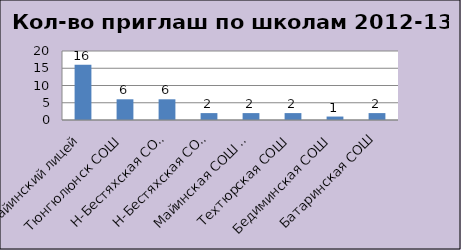
| Category | Series 0 |
|---|---|
| Майинский лицей | 16 |
| Тюнгюлюнск СОШ | 6 |
| Н-Бестяхская СОШ №2 | 6 |
| Н-Бестяхская СОШ №1 | 2 |
| Майинская СОШ №1 | 2 |
| Техтюрская СОШ | 2 |
| Бедиминская СОШ | 1 |
| Батаринская СОШ | 2 |